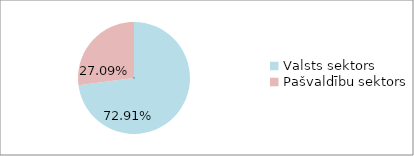
| Category | Series 0 |
|---|---|
| Valsts sektors | 0.729 |
| Pašvaldību sektors | 0.271 |